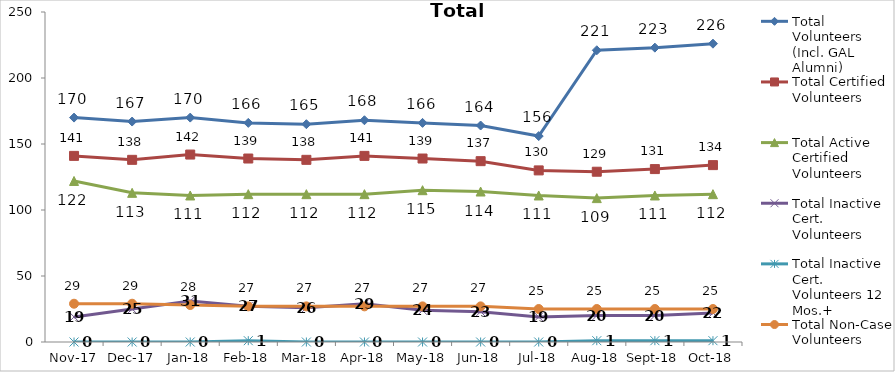
| Category | Total Volunteers (Incl. GAL Alumni) | Total Certified Volunteers | Total Active Certified Volunteers | Total Inactive Cert. Volunteers | Total Inactive Cert. Volunteers 12 Mos.+ | Total Non-Case Volunteers |
|---|---|---|---|---|---|---|
| 2017-11-01 | 170 | 141 | 122 | 19 | 0 | 29 |
| 2017-12-01 | 167 | 138 | 113 | 25 | 0 | 29 |
| 2018-01-01 | 170 | 142 | 111 | 31 | 0 | 28 |
| 2018-02-01 | 166 | 139 | 112 | 27 | 1 | 27 |
| 2018-03-01 | 165 | 138 | 112 | 26 | 0 | 27 |
| 2018-04-01 | 168 | 141 | 112 | 29 | 0 | 27 |
| 2018-05-01 | 166 | 139 | 115 | 24 | 0 | 27 |
| 2018-06-01 | 164 | 137 | 114 | 23 | 0 | 27 |
| 2018-07-01 | 156 | 130 | 111 | 19 | 0 | 25 |
| 2018-08-01 | 221 | 129 | 109 | 20 | 1 | 25 |
| 2018-09-01 | 223 | 131 | 111 | 20 | 1 | 25 |
| 2018-10-01 | 226 | 134 | 112 | 22 | 1 | 25 |